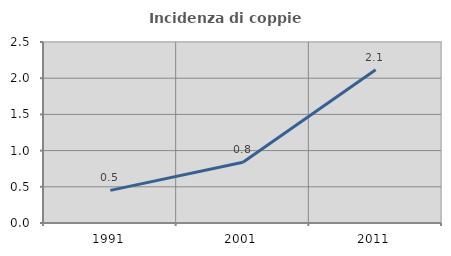
| Category | Incidenza di coppie miste |
|---|---|
| 1991.0 | 0.451 |
| 2001.0 | 0.84 |
| 2011.0 | 2.117 |